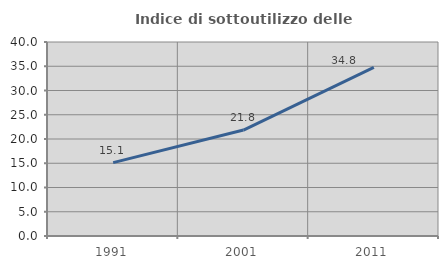
| Category | Indice di sottoutilizzo delle abitazioni  |
|---|---|
| 1991.0 | 15.126 |
| 2001.0 | 21.844 |
| 2011.0 | 34.753 |